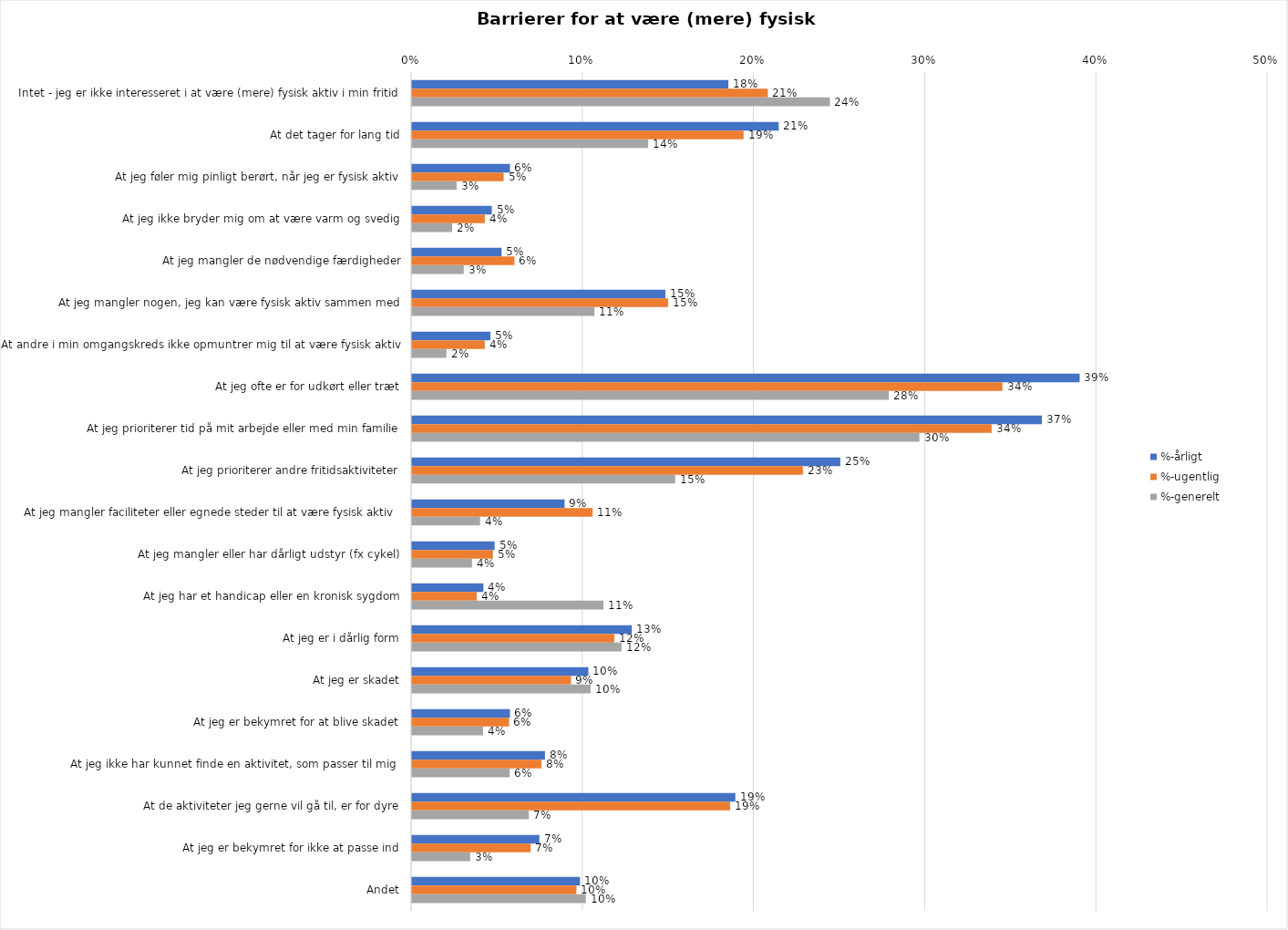
| Category | %-årligt | %-ugentlig | %-generelt |
|---|---|---|---|
| Intet - jeg er ikke interesseret i at være (mere) fysisk aktiv i min fritid | 0.185 | 0.208 | 0.244 |
| At det tager for lang tid | 0.214 | 0.194 | 0.138 |
| At jeg føler mig pinligt berørt, når jeg er fysisk aktiv | 0.057 | 0.054 | 0.026 |
| At jeg ikke bryder mig om at være varm og svedig | 0.047 | 0.043 | 0.023 |
| At jeg mangler de nødvendige færdigheder | 0.052 | 0.06 | 0.03 |
| At jeg mangler nogen, jeg kan være fysisk aktiv sammen med | 0.148 | 0.15 | 0.107 |
| At andre i min omgangskreds ikke opmuntrer mig til at være fysisk aktiv | 0.046 | 0.043 | 0.02 |
| At jeg ofte er for udkørt eller træt | 0.39 | 0.345 | 0.279 |
| At jeg prioriterer tid på mit arbejde eller med min familie | 0.368 | 0.339 | 0.296 |
| At jeg prioriterer andre fritidsaktiviteter | 0.25 | 0.228 | 0.154 |
| At jeg mangler faciliteter eller egnede steder til at være fysisk aktiv  | 0.089 | 0.106 | 0.04 |
| At jeg mangler eller har dårligt udstyr (fx cykel) | 0.048 | 0.047 | 0.035 |
| At jeg har et handicap eller en kronisk sygdom | 0.042 | 0.038 | 0.112 |
| At jeg er i dårlig form | 0.128 | 0.118 | 0.122 |
| At jeg er skadet | 0.103 | 0.093 | 0.104 |
| At jeg er bekymret for at blive skadet | 0.057 | 0.057 | 0.041 |
| At jeg ikke har kunnet finde en aktivitet, som passer til mig  | 0.078 | 0.076 | 0.057 |
| At de aktiviteter jeg gerne vil gå til, er for dyre | 0.189 | 0.186 | 0.068 |
| At jeg er bekymret for ikke at passe ind | 0.074 | 0.069 | 0.034 |
| Andet | 0.098 | 0.096 | 0.102 |